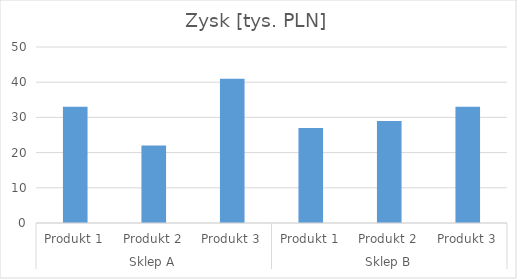
| Category | Zysk [tys. PLN] |
|---|---|
| 0 | 33 |
| 1 | 22 |
| 2 | 41 |
| 3 | 27 |
| 4 | 29 |
| 5 | 33 |